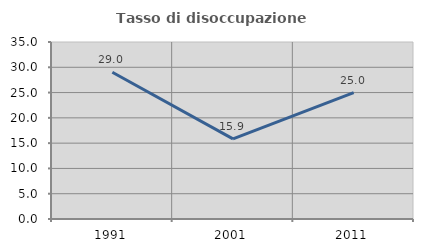
| Category | Tasso di disoccupazione giovanile  |
|---|---|
| 1991.0 | 29.012 |
| 2001.0 | 15.854 |
| 2011.0 | 25 |